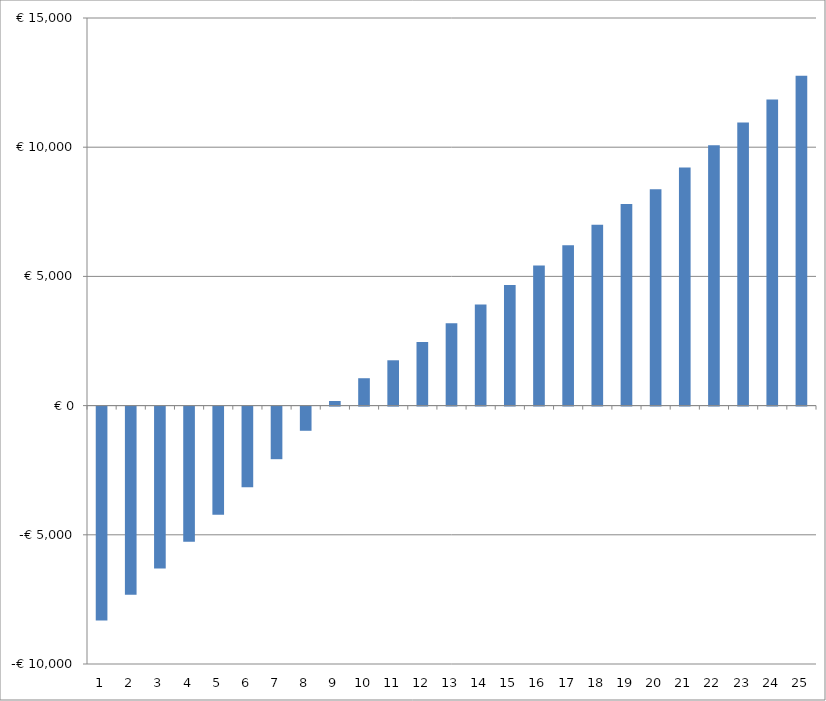
| Category | Series 0 |
|---|---|
| 0 | -6882.263 |
| 1 | -5999.842 |
| 2 | -5111.359 |
| 3 | -4216.423 |
| 4 | -3314.637 |
| 5 | -2405.591 |
| 6 | -1488.866 |
| 7 | -564.029 |
| 8 | 369.362 |
| 9 | 1061.761 |
| 10 | 2013.635 |
| 11 | 2975.462 |
| 12 | 3947.736 |
| 13 | 4930.962 |
| 14 | 5925.658 |
| 15 | 6932.359 |
| 16 | 7951.614 |
| 17 | 8983.985 |
| 18 | 10030.052 |
| 19 | 10840.41 |
| 20 | 11679.945 |
| 21 | 12537.134 |
| 22 | 13412.604 |
| 23 | 14307.003 |
| 24 | 15220.995 |